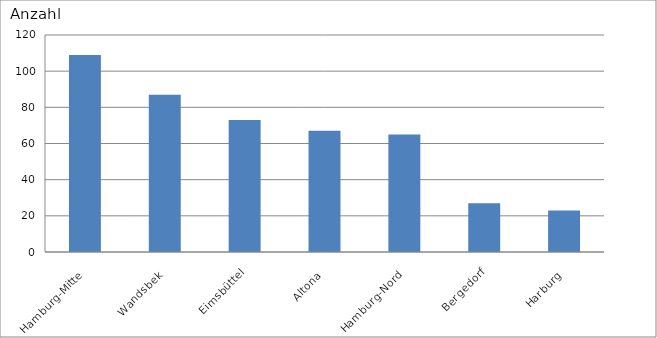
| Category | Hamburg-Mitte Wandsbek Eimsbüttel Altona Hamburg-Nord Bergedorf Harburg |
|---|---|
| Hamburg-Mitte | 109 |
| Wandsbek | 87 |
| Eimsbüttel | 73 |
| Altona | 67 |
| Hamburg-Nord | 65 |
| Bergedorf | 27 |
| Harburg | 23 |